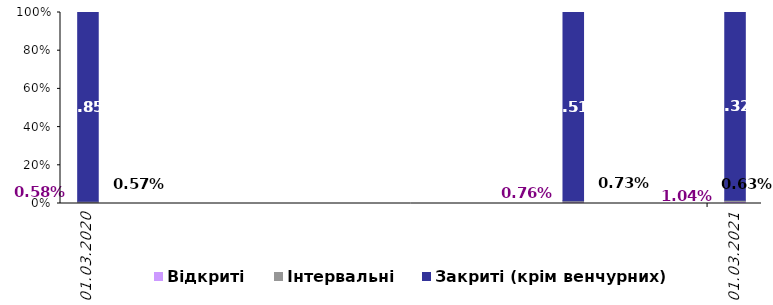
| Category | Відкриті | Інтервальні | Закриті (крім венчурних) |
|---|---|---|---|
| 2020-03-31 | 0.006 | 0.006 | 0.989 |
| 2020-12-31 | 0.008 | 0.007 | 0.985 |
| 2021-03-31 | 0.01 | 0.006 | 0.983 |